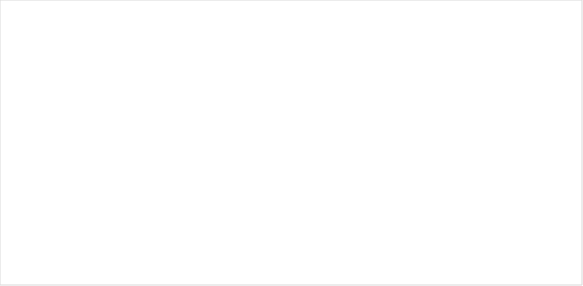
| Category | Total |
|---|---|
| 2008 | 1 |
| 2009 | 7 |
| 2010 | 3 |
| 2011 | 4 |
| 2012 | 2 |
| 2013 | 1 |
| 2014 | 3 |
| 2015 | 0 |
| 2016 | 3 |
| 2017 | 2 |